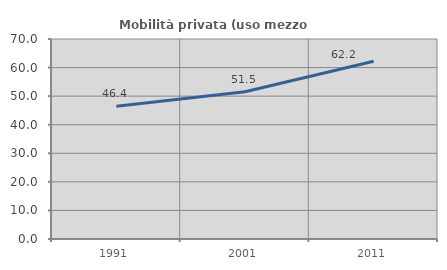
| Category | Mobilità privata (uso mezzo privato) |
|---|---|
| 1991.0 | 46.448 |
| 2001.0 | 51.509 |
| 2011.0 | 62.222 |